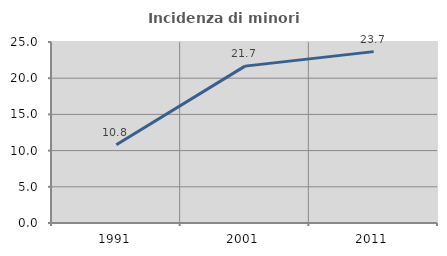
| Category | Incidenza di minori stranieri |
|---|---|
| 1991.0 | 10.811 |
| 2001.0 | 21.667 |
| 2011.0 | 23.671 |